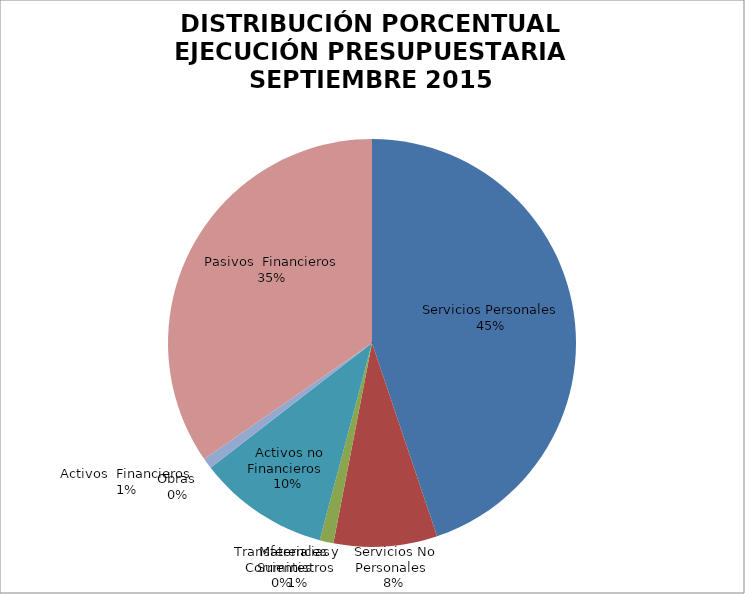
| Category | Series 0 | Series 1 |
|---|---|---|
| Servicios Personales | 20863567.09 | 1.459 |
| Servicios No Personales | 3817931.98 | 0.267 |
| Materiales y Suministros | 509033.11 | 0.036 |
| Transferencias Corrientes | 0 | 0 |
| Activos no Financieros | 4837551.39 | 0.338 |
| Obras | 0 | 0 |
| Activos  Financieros | 392387.41 | 0.027 |
| Pasivos  Financieros | -16117178.27 | -1.127 |